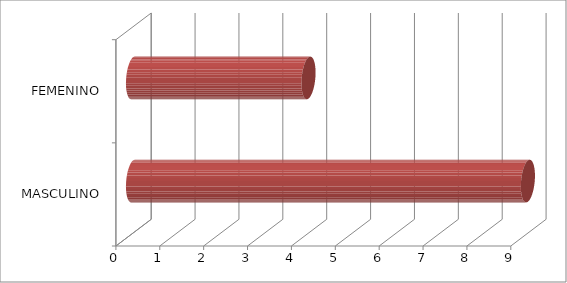
| Category | Series 0 |
|---|---|
| MASCULINO | 9 |
| FEMENINO | 4 |